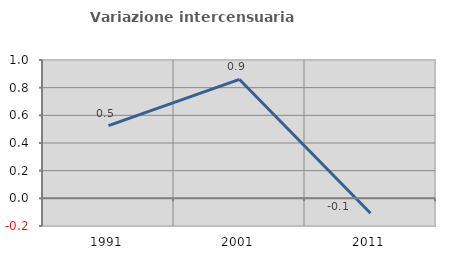
| Category | Variazione intercensuaria annua |
|---|---|
| 1991.0 | 0.525 |
| 2001.0 | 0.859 |
| 2011.0 | -0.107 |